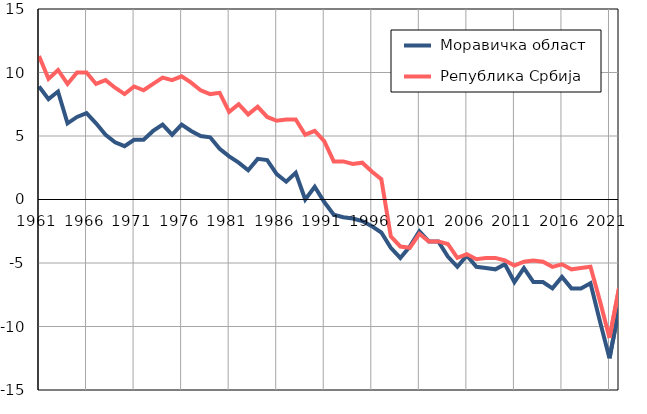
| Category |  Моравичка област |  Република Србија |
|---|---|---|
| 1961.0 | 8.9 | 11.3 |
| 1962.0 | 7.9 | 9.5 |
| 1963.0 | 8.5 | 10.2 |
| 1964.0 | 6 | 9.1 |
| 1965.0 | 6.5 | 10 |
| 1966.0 | 6.8 | 10 |
| 1967.0 | 6 | 9.1 |
| 1968.0 | 5.1 | 9.4 |
| 1969.0 | 4.5 | 8.8 |
| 1970.0 | 4.2 | 8.3 |
| 1971.0 | 4.7 | 8.9 |
| 1972.0 | 4.7 | 8.6 |
| 1973.0 | 5.4 | 9.1 |
| 1974.0 | 5.9 | 9.6 |
| 1975.0 | 5.1 | 9.4 |
| 1976.0 | 5.9 | 9.7 |
| 1977.0 | 5.4 | 9.2 |
| 1978.0 | 5 | 8.6 |
| 1979.0 | 4.9 | 8.3 |
| 1980.0 | 4 | 8.4 |
| 1981.0 | 3.4 | 6.9 |
| 1982.0 | 2.9 | 7.5 |
| 1983.0 | 2.3 | 6.7 |
| 1984.0 | 3.2 | 7.3 |
| 1985.0 | 3.1 | 6.5 |
| 1986.0 | 2 | 6.2 |
| 1987.0 | 1.4 | 6.3 |
| 1988.0 | 2.1 | 6.3 |
| 1989.0 | 0 | 5.1 |
| 1990.0 | 1 | 5.4 |
| 1991.0 | -0.2 | 4.6 |
| 1992.0 | -1.2 | 3 |
| 1993.0 | -1.4 | 3 |
| 1994.0 | -1.5 | 2.8 |
| 1995.0 | -1.7 | 2.9 |
| 1996.0 | -2.1 | 2.2 |
| 1997.0 | -2.6 | 1.6 |
| 1998.0 | -3.8 | -2.9 |
| 1999.0 | -4.6 | -3.7 |
| 2000.0 | -3.7 | -3.8 |
| 2001.0 | -2.5 | -2.7 |
| 2002.0 | -3.3 | -3.3 |
| 2003.0 | -3.3 | -3.3 |
| 2004.0 | -4.5 | -3.5 |
| 2005.0 | -5.3 | -4.6 |
| 2006.0 | -4.4 | -4.3 |
| 2007.0 | -5.3 | -4.7 |
| 2008.0 | -5.4 | -4.6 |
| 2009.0 | -5.5 | -4.6 |
| 2010.0 | -5.1 | -4.8 |
| 2011.0 | -6.5 | -5.2 |
| 2012.0 | -5.4 | -4.9 |
| 2013.0 | -6.5 | -4.8 |
| 2014.0 | -6.5 | -4.9 |
| 2015.0 | -7 | -5.3 |
| 2016.0 | -6.1 | -5.1 |
| 2017.0 | -7 | -5.5 |
| 2018.0 | -7 | -5.4 |
| 2019.0 | -6.6 | -5.3 |
| 2020.0 | -9.6 | -8 |
| 2021.0 | -12.5 | -10.9 |
| 2022.0 | -8.6 | -7 |